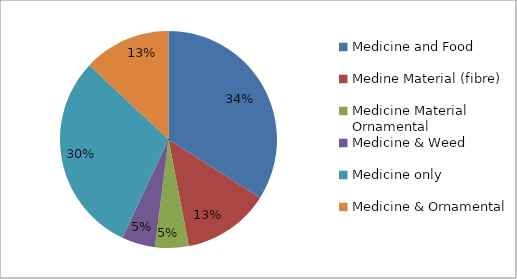
| Category | Series 0 |
|---|---|
| Medicine and Food | 0.34 |
| Medine Material (fibre) | 0.13 |
| Medicine Material Ornamental | 0.05 |
| Medicine & Weed | 0.05 |
| Medicine only | 0.3 |
| Medicine & Ornamental | 0.13 |